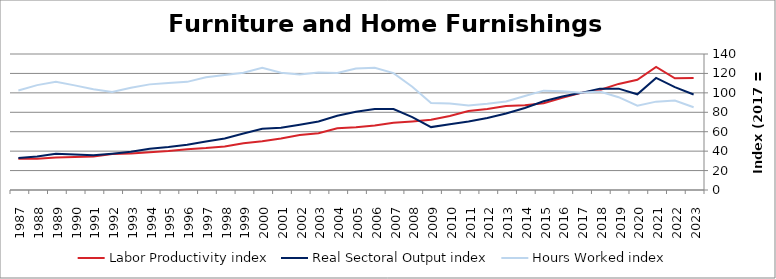
| Category | Labor Productivity index | Real Sectoral Output index | Hours Worked index |
|---|---|---|---|
| 2023.0 | 115.34 | 98.256 | 85.188 |
| 2022.0 | 115.039 | 105.859 | 92.021 |
| 2021.0 | 126.804 | 115.331 | 90.952 |
| 2020.0 | 113.445 | 98.53 | 86.853 |
| 2019.0 | 109.222 | 104.333 | 95.523 |
| 2018.0 | 102.984 | 104.35 | 101.326 |
| 2017.0 | 100 | 100 | 100 |
| 2016.0 | 94.828 | 96.311 | 101.564 |
| 2015.0 | 89.283 | 91.313 | 102.274 |
| 2014.0 | 87.298 | 84.403 | 96.684 |
| 2013.0 | 86.483 | 78.788 | 91.103 |
| 2012.0 | 83.498 | 74.037 | 88.67 |
| 2011.0 | 81.229 | 70.559 | 86.864 |
| 2010.0 | 76.088 | 67.792 | 89.096 |
| 2009.0 | 72.212 | 64.752 | 89.669 |
| 2008.0 | 70.559 | 74.991 | 106.281 |
| 2007.0 | 69.335 | 83.414 | 120.305 |
| 2006.0 | 66.348 | 83.493 | 125.842 |
| 2005.0 | 64.482 | 80.655 | 125.081 |
| 2004.0 | 63.445 | 76.433 | 120.471 |
| 2003.0 | 58.365 | 70.576 | 120.923 |
| 2002.0 | 56.52 | 67.205 | 118.905 |
| 2001.0 | 53.122 | 64.085 | 120.637 |
| 2000.0 | 50.167 | 63.147 | 125.875 |
| 1999.0 | 48.205 | 58.218 | 120.771 |
| 1998.0 | 44.872 | 53.077 | 118.284 |
| 1997.0 | 43.111 | 50.028 | 116.043 |
| 1996.0 | 41.928 | 46.675 | 111.322 |
| 1995.0 | 40.173 | 44.235 | 110.112 |
| 1994.0 | 38.973 | 42.378 | 108.737 |
| 1993.0 | 37.507 | 39.44 | 105.154 |
| 1992.0 | 37.113 | 37.405 | 100.787 |
| 1991.0 | 34.514 | 35.762 | 103.616 |
| 1990.0 | 33.921 | 36.536 | 107.709 |
| 1989.0 | 33.448 | 37.252 | 111.375 |
| 1988.0 | 32.05 | 34.604 | 107.968 |
| 1987.0 | 32.261 | 33.029 | 102.383 |